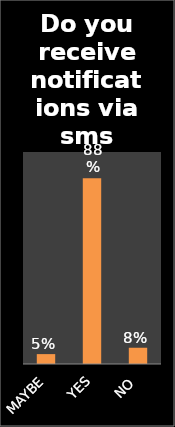
| Category | Series 0 |
|---|---|
| MAYBE | 0.047 |
| YES | 0.877 |
| NO | 0.077 |